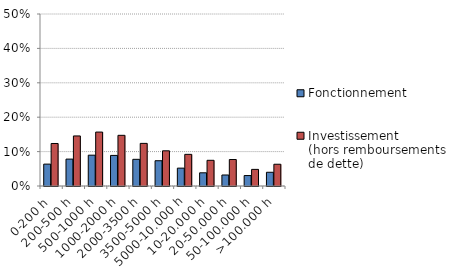
| Category | Fonctionnement | Investissement 
(hors remboursements 
de dette) |
|---|---|---|
| 0-200 h | 0.064 | 0.124 |
| 200-500 h | 0.078 | 0.145 |
| 500-1000 h | 0.09 | 0.157 |
| 1000-2000 h | 0.089 | 0.147 |
| 2000-3500 h | 0.078 | 0.124 |
| 3500-5000 h | 0.073 | 0.102 |
| 5000-10.000 h | 0.052 | 0.092 |
| 10-20.000 h | 0.038 | 0.075 |
| 20-50.000 h | 0.032 | 0.077 |
| 50-100.000 h | 0.03 | 0.048 |
| >100.000 h | 0.04 | 0.063 |